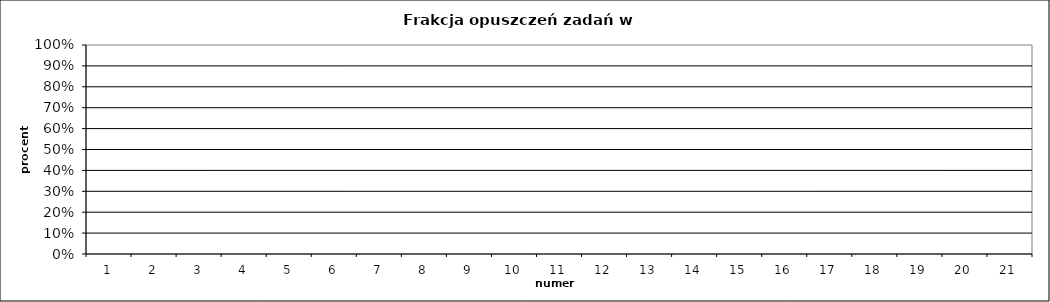
| Category | Series 0 |
|---|---|
| 1.0 | 0 |
| 2.0 | 0 |
| 3.0 | 0 |
| 4.0 | 0 |
| 5.0 | 0 |
| 6.0 | 0 |
| 7.0 | 0 |
| 8.0 | 0 |
| 9.0 | 0 |
| 10.0 | 0 |
| 11.0 | 0 |
| 12.0 | 0 |
| 13.0 | 0 |
| 14.0 | 0 |
| 15.0 | 0 |
| 16.0 | 0 |
| 17.0 | 0 |
| 18.0 | 0 |
| 19.0 | 0 |
| 20.0 | 0 |
| 21.0 | 0 |